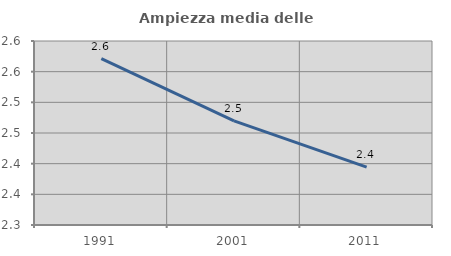
| Category | Ampiezza media delle famiglie |
|---|---|
| 1991.0 | 2.571 |
| 2001.0 | 2.47 |
| 2011.0 | 2.394 |